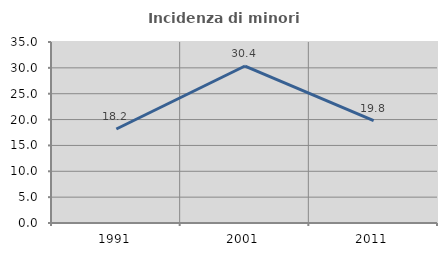
| Category | Incidenza di minori stranieri |
|---|---|
| 1991.0 | 18.182 |
| 2001.0 | 30.357 |
| 2011.0 | 19.78 |